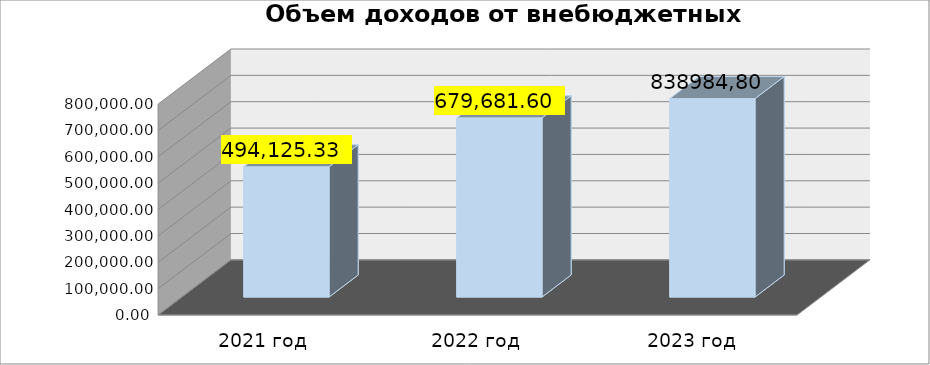
| Category | Series 0 |
|---|---|
| 2021 год | 494125.33 |
| 2022 год | 679681.6 |
|  2023 год | 752728.6 |